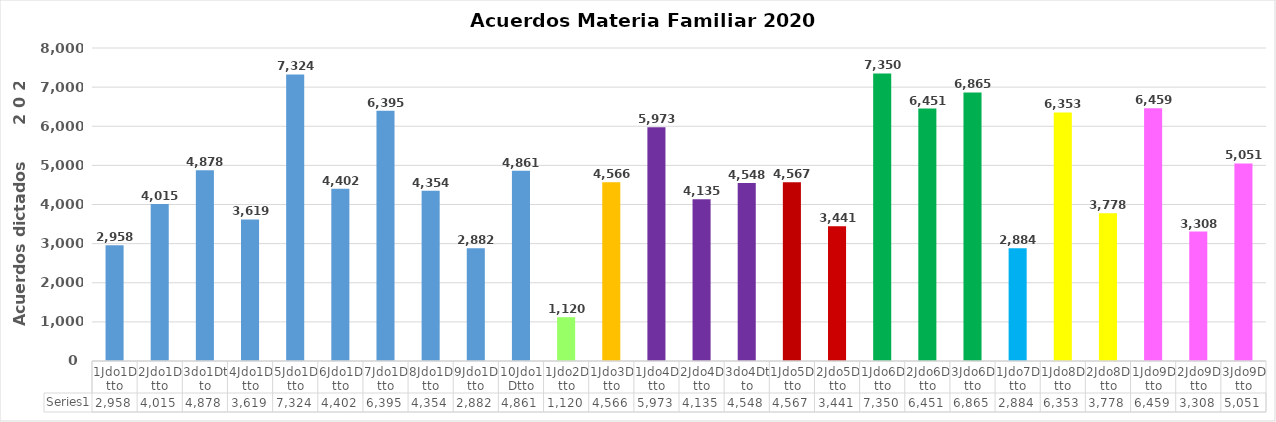
| Category | Series 0 |
|---|---|
| 1Jdo1Dtto | 2958 |
| 2Jdo1Dtto | 4015 |
| 3do1Dtto | 4878 |
| 4Jdo1Dtto | 3619 |
| 5Jdo1Dtto | 7324 |
| 6Jdo1Dtto | 4402 |
| 7Jdo1Dtto | 6395 |
| 8Jdo1Dtto | 4354 |
| 9Jdo1Dtto | 2882 |
| 10Jdo1Dtto | 4861 |
| 1Jdo2Dtto | 1120 |
| 1Jdo3Dtto | 4566 |
| 1Jdo4Dtto | 5973 |
| 2Jdo4Dtto | 4135 |
| 3do4Dtto | 4548 |
| 1Jdo5Dtto | 4567 |
| 2Jdo5Dtto | 3441 |
| 1Jdo6Dtto | 7350 |
| 2Jdo6Dtto | 6451 |
| 3Jdo6Dtto | 6865 |
| 1Jdo7Dtto | 2884 |
| 1Jdo8Dtto | 6353 |
| 2Jdo8Dtto | 3778 |
| 1Jdo9Dtto | 6459 |
| 2Jdo9Dtto | 3308 |
| 3Jdo9Dtto | 5051 |